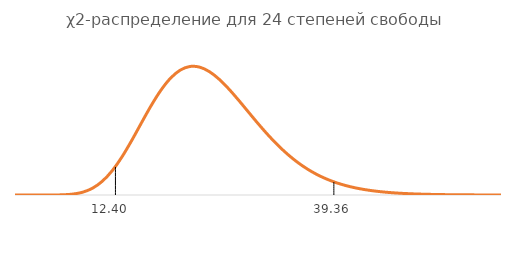
| Category | n = 24 |
|---|---|
| 1e-10 | 0 |
| 1.2000000001 | 0 |
| 2.4000000001 | 0 |
| 3.6000000000999997 | 0 |
| 4.8000000001 | 0 |
| 6.0000000001 | 0 |
| 7.2000000001 | 0 |
| 8.4000000001 | 0.001 |
| 9.6000000001 | 0.003 |
| 10.800000000099999 | 0.006 |
| 12.000000000099998 | 0.011 |
| 13.200000000099998 | 0.018 |
| 14.400000000099997 | 0.025 |
| 15.600000000099996 | 0.033 |
| 16.800000000099995 | 0.041 |
| 18.000000000099995 | 0.049 |
| 19.200000000099994 | 0.054 |
| 20.400000000099993 | 0.058 |
| 21.600000000099993 | 0.06 |
| 22.800000000099992 | 0.059 |
| 24.00000000009999 | 0.057 |
| 25.20000000009999 | 0.054 |
| 26.40000000009999 | 0.049 |
| 27.60000000009999 | 0.044 |
| 28.80000000009999 | 0.039 |
| 30.000000000099988 | 0.033 |
| 31.200000000099987 | 0.028 |
| 32.400000000099986 | 0.023 |
| 33.60000000009999 | 0.019 |
| 34.80000000009999 | 0.015 |
| 36.000000000099995 | 0.012 |
| 37.2000000001 | 0.01 |
| 38.4000000001 | 0.008 |
| 39.6000000001 | 0.006 |
| 40.800000000100006 | 0.004 |
| 42.00000000010001 | 0.003 |
| 43.20000000010001 | 0.002 |
| 44.400000000100015 | 0.002 |
| 45.60000000010002 | 0.001 |
| 46.80000000010002 | 0.001 |
| 48.00000000010002 | 0.001 |
| 49.200000000100026 | 0.001 |
| 50.40000000010003 | 0 |
| 51.60000000010003 | 0 |
| 52.800000000100034 | 0 |
| 54.00000000010004 | 0 |
| 55.20000000010004 | 0 |
| 56.40000000010004 | 0 |
| 57.600000000100046 | 0 |
| 58.80000000010005 | 0 |
| 60.00000000010005 | 0 |
| 61.200000000100054 | 0 |
| 62.40000000010006 | 0 |
| 63.60000000010006 | 0 |
| 64.80000000010006 | 0 |
| 66.00000000010006 | 0 |
| 67.20000000010006 | 0 |